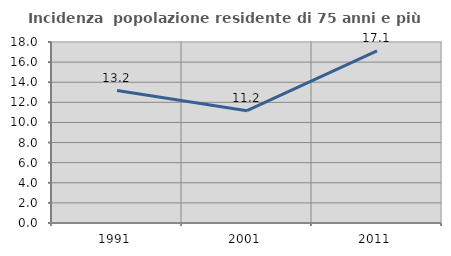
| Category | Incidenza  popolazione residente di 75 anni e più |
|---|---|
| 1991.0 | 13.17 |
| 2001.0 | 11.165 |
| 2011.0 | 17.128 |